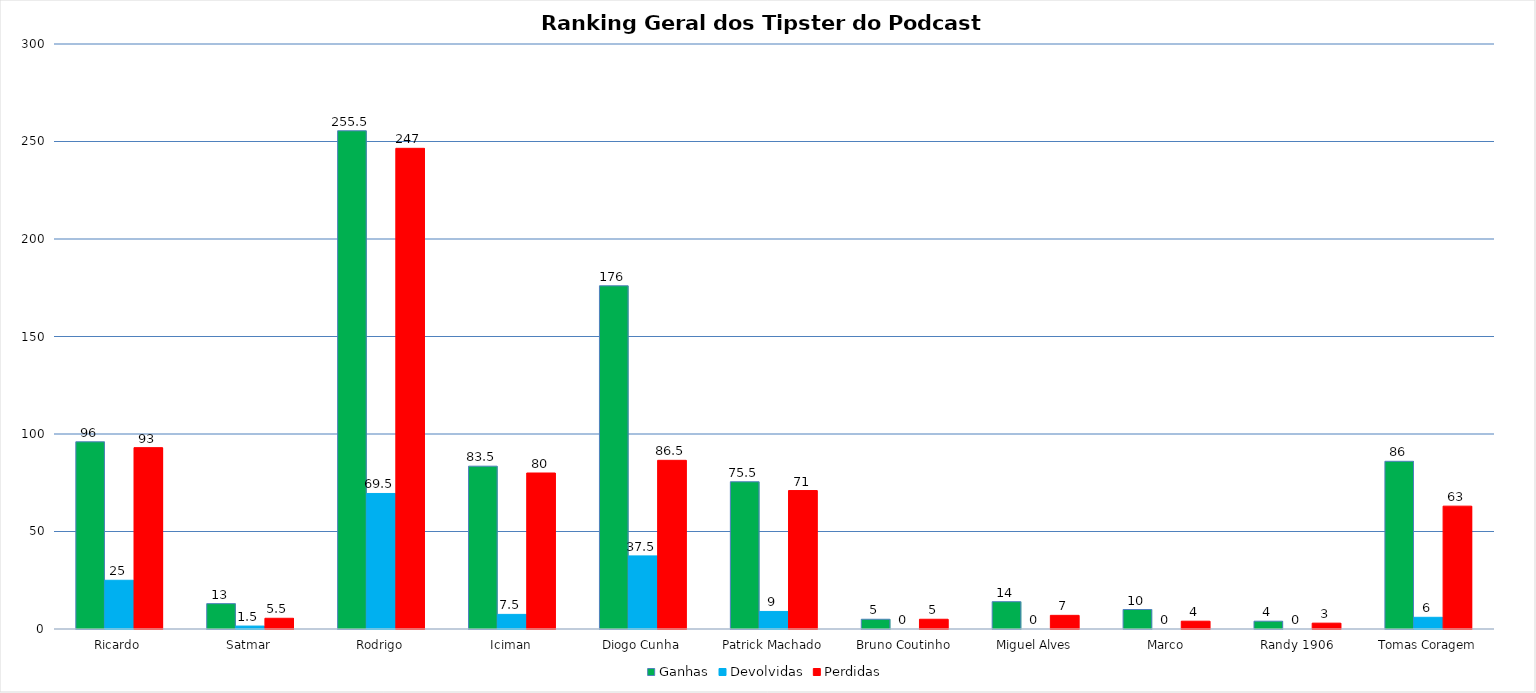
| Category | Ganhas | Devolvidas | Perdidas |
|---|---|---|---|
| Ricardo | 96 | 25 | 93 |
| Satmar | 13 | 1.5 | 5.5 |
| Rodrigo | 255.5 | 69.5 | 246.5 |
| Iciman | 83.5 | 7.5 | 80 |
| Diogo Cunha | 176 | 37.5 | 86.5 |
| Patrick Machado | 75.5 | 9 | 71 |
| Bruno Coutinho | 5 | 0 | 5 |
| Miguel Alves | 14 | 0 | 7 |
| Marco | 10 | 0 | 4 |
| Randy 1906 | 4 | 0 | 3 |
| Tomas Coragem | 86 | 6 | 63 |